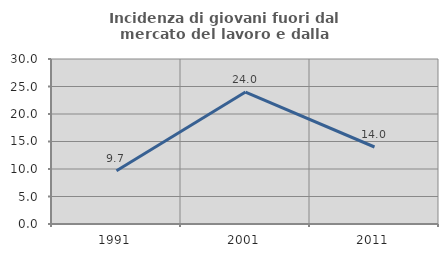
| Category | Incidenza di giovani fuori dal mercato del lavoro e dalla formazione  |
|---|---|
| 1991.0 | 9.684 |
| 2001.0 | 23.997 |
| 2011.0 | 14 |